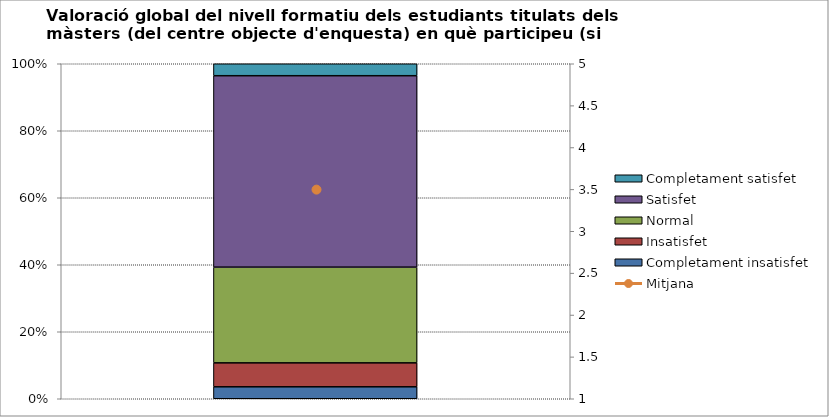
| Category | Completament insatisfet | Insatisfet | Normal | Satisfet | Completament satisfet |
|---|---|---|---|---|---|
| 0 | 1 | 2 | 8 | 16 | 1 |